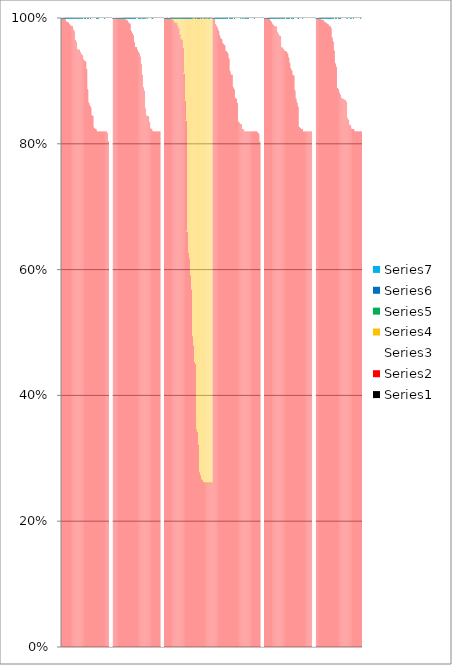
| Category | Series 0 | Series 1 | Series 2 | Series 3 | Series 4 | Series 5 | Series 6 |
|---|---|---|---|---|---|---|---|
| 0 | 0 | 1 | 0 | 0 | 0 | 0 | 0 |
| 1 | 0 | 1 | 0 | 0 | 0 | 0 | 0 |
| 2 | 0 | 0.999 | 0.001 | 0 | 0 | 0 | 0 |
| 3 | 0 | 0.999 | 0.001 | 0 | 0 | 0 | 0 |
| 4 | 0 | 0.999 | 0.001 | 0 | 0 | 0 | 0 |
| 5 | 0 | 0.995 | 0.005 | 0 | 0 | 0 | 0 |
| 6 | 0 | 0.993 | 0.007 | 0 | 0 | 0 | 0 |
| 7 | 0 | 0.993 | 0.007 | 0 | 0 | 0 | 0 |
| 8 | 0 | 0.991 | 0.009 | 0 | 0 | 0 | 0 |
| 9 | 0 | 0.989 | 0.011 | 0 | 0 | 0 | 0 |
| 10 | 0 | 0.987 | 0.013 | 0 | 0 | 0 | 0 |
| 11 | 0 | 0.987 | 0.013 | 0 | 0 | 0 | 0 |
| 12 | 0 | 0.982 | 0.018 | 0 | 0 | 0 | 0 |
| 13 | 0 | 0.979 | 0.021 | 0 | 0 | 0 | 0 |
| 14 | 0 | 0.965 | 0.035 | 0 | 0 | 0 | 0 |
| 15 | 0 | 0.962 | 0.038 | 0 | 0 | 0 | 0 |
| 16 | 0 | 0.95 | 0.05 | 0 | 0 | 0 | 0 |
| 17 | 0 | 0.95 | 0.05 | 0 | 0 | 0 | 0 |
| 18 | 0 | 0.95 | 0.05 | 0 | 0 | 0 | 0 |
| 19 | 0 | 0.945 | 0.055 | 0 | 0 | 0 | 0 |
| 20 | 0 | 0.942 | 0.058 | 0 | 0 | 0 | 0 |
| 21 | 0 | 0.94 | 0.06 | 0 | 0 | 0 | 0 |
| 22 | 0 | 0.934 | 0.066 | 0 | 0 | 0 | 0 |
| 23 | 0 | 0.931 | 0.069 | 0 | 0 | 0 | 0 |
| 24 | 0 | 0.931 | 0.069 | 0 | 0 | 0 | 0 |
| 25 | 0 | 0.918 | 0.082 | 0 | 0 | 0 | 0 |
| 26 | 0 | 0.886 | 0.114 | 0 | 0 | 0 | 0 |
| 27 | 0 | 0.865 | 0.135 | 0 | 0 | 0 | 0 |
| 28 | 0 | 0.861 | 0.139 | 0 | 0 | 0 | 0 |
| 29 | 0 | 0.858 | 0.142 | 0 | 0 | 0 | 0 |
| 30 | 0 | 0.845 | 0.155 | 0 | 0 | 0 | 0 |
| 31 | 0 | 0.844 | 0.156 | 0 | 0 | 0 | 0 |
| 32 | 0 | 0.826 | 0.174 | 0 | 0 | 0 | 0 |
| 33 | 0 | 0.824 | 0.176 | 0 | 0 | 0 | 0 |
| 34 | 0 | 0.824 | 0.176 | 0 | 0 | 0 | 0 |
| 35 | 0 | 0.82 | 0.18 | 0 | 0 | 0 | 0 |
| 36 | 0 | 0.82 | 0.18 | 0 | 0 | 0 | 0 |
| 37 | 0 | 0.82 | 0.18 | 0 | 0 | 0 | 0 |
| 38 | 0 | 0.82 | 0.18 | 0 | 0 | 0 | 0 |
| 39 | 0 | 0.82 | 0.18 | 0 | 0 | 0 | 0 |
| 40 | 0 | 0.82 | 0.18 | 0 | 0 | 0 | 0 |
| 41 | 0 | 0.82 | 0.18 | 0 | 0 | 0 | 0 |
| 42 | 0 | 0.82 | 0.18 | 0 | 0 | 0 | 0 |
| 43 | 0 | 0.82 | 0.18 | 0 | 0 | 0 | 0 |
| 44 | 0 | 0.82 | 0.18 | 0 | 0 | 0 | 0 |
| 45 | 0 | 0.817 | 0.183 | 0 | 0 | 0 | 0 |
| 46 | 0 | 0.804 | 0.196 | 0 | 0 | 0 | 0 |
| 47 | 0 | 0 | 1 | 0 | 0 | 0 | 0 |
| 48 | 0 | 0 | 1 | 0 | 0 | 0 | 0 |
| 49 | 0 | 0 | 1 | 0 | 0 | 0 | 0 |
| 50 | 0 | 1 | 0 | 0 | 0 | 0 | 0 |
| 51 | 0 | 1 | 0 | 0 | 0 | 0 | 0 |
| 52 | 0 | 1 | 0 | 0 | 0 | 0 | 0 |
| 53 | 0 | 1 | 0 | 0 | 0 | 0 | 0 |
| 54 | 0 | 1 | 0 | 0 | 0 | 0 | 0 |
| 55 | 0 | 1 | 0 | 0 | 0 | 0 | 0 |
| 56 | 0 | 1 | 0 | 0 | 0 | 0 | 0 |
| 57 | 0 | 1 | 0 | 0 | 0 | 0 | 0 |
| 58 | 0 | 1 | 0 | 0 | 0 | 0 | 0 |
| 59 | 0 | 1 | 0 | 0 | 0 | 0 | 0 |
| 60 | 0 | 0.999 | 0.001 | 0 | 0 | 0 | 0 |
| 61 | 0 | 0.999 | 0.001 | 0 | 0 | 0 | 0 |
| 62 | 0 | 0.998 | 0.002 | 0 | 0 | 0 | 0 |
| 63 | 0 | 0.998 | 0.002 | 0 | 0 | 0 | 0 |
| 64 | 0 | 0.997 | 0.003 | 0 | 0 | 0 | 0 |
| 65 | 0 | 0.994 | 0.006 | 0 | 0 | 0 | 0 |
| 66 | 0 | 0.992 | 0.008 | 0 | 0 | 0 | 0 |
| 67 | 0 | 0.991 | 0.009 | 0 | 0 | 0 | 0 |
| 68 | 0 | 0.98 | 0.02 | 0 | 0 | 0 | 0 |
| 69 | 0 | 0.976 | 0.024 | 0 | 0 | 0 | 0 |
| 70 | 0 | 0.973 | 0.027 | 0 | 0 | 0 | 0 |
| 71 | 0 | 0.962 | 0.038 | 0 | 0 | 0 | 0 |
| 72 | 0 | 0.954 | 0.046 | 0 | 0 | 0 | 0 |
| 73 | 0 | 0.954 | 0.046 | 0 | 0 | 0 | 0 |
| 74 | 0 | 0.95 | 0.05 | 0 | 0 | 0 | 0 |
| 75 | 0 | 0.946 | 0.054 | 0 | 0 | 0 | 0 |
| 76 | 0 | 0.944 | 0.056 | 0 | 0 | 0 | 0 |
| 77 | 0 | 0.939 | 0.061 | 0 | 0 | 0 | 0 |
| 78 | 0 | 0.927 | 0.073 | 0 | 0 | 0 | 0 |
| 79 | 0 | 0.91 | 0.09 | 0 | 0 | 0 | 0 |
| 80 | 0 | 0.89 | 0.11 | 0 | 0 | 0 | 0 |
| 81 | 0 | 0.884 | 0.116 | 0 | 0 | 0 | 0 |
| 82 | 0 | 0.856 | 0.144 | 0 | 0 | 0 | 0 |
| 83 | 0 | 0.845 | 0.155 | 0 | 0 | 0 | 0 |
| 84 | 0 | 0.844 | 0.156 | 0 | 0 | 0 | 0 |
| 85 | 0 | 0.843 | 0.157 | 0 | 0 | 0 | 0 |
| 86 | 0 | 0.834 | 0.166 | 0 | 0 | 0 | 0 |
| 87 | 0 | 0.824 | 0.176 | 0 | 0 | 0 | 0 |
| 88 | 0 | 0.824 | 0.176 | 0 | 0 | 0 | 0 |
| 89 | 0 | 0.82 | 0.18 | 0 | 0 | 0 | 0 |
| 90 | 0 | 0.82 | 0.18 | 0 | 0 | 0 | 0 |
| 91 | 0 | 0.82 | 0.18 | 0 | 0 | 0 | 0 |
| 92 | 0 | 0.82 | 0.18 | 0 | 0 | 0 | 0 |
| 93 | 0 | 0.82 | 0.18 | 0 | 0 | 0 | 0 |
| 94 | 0 | 0.82 | 0.18 | 0 | 0 | 0 | 0 |
| 95 | 0 | 0.82 | 0.18 | 0 | 0 | 0 | 0 |
| 96 | 0 | 0.82 | 0.18 | 0 | 0 | 0 | 0 |
| 97 | 0 | 0 | 1 | 0 | 0 | 0 | 0 |
| 98 | 0 | 0 | 1 | 0 | 0 | 0 | 0 |
| 99 | 0 | 0 | 1 | 0 | 0 | 0 | 0 |
| 100 | 0 | 1 | 0 | 0 | 0 | 0 | 0 |
| 101 | 0 | 1 | 0 | 0 | 0 | 0 | 0 |
| 102 | 0 | 1 | 0 | 0 | 0 | 0 | 0 |
| 103 | 0 | 1 | 0 | 0 | 0 | 0 | 0 |
| 104 | 0 | 1 | 0 | 0 | 0 | 0 | 0 |
| 105 | 0 | 1 | 0 | 0 | 0 | 0 | 0 |
| 106 | 0 | 0.999 | 0 | 0.001 | 0 | 0 | 0 |
| 107 | 0 | 0.999 | 0 | 0.001 | 0 | 0 | 0 |
| 108 | 0 | 0.998 | 0 | 0.002 | 0 | 0 | 0 |
| 109 | 0 | 0.996 | 0 | 0.004 | 0 | 0 | 0 |
| 110 | 0 | 0.993 | 0 | 0.007 | 0 | 0 | 0 |
| 111 | 0 | 0.993 | 0 | 0.007 | 0 | 0 | 0 |
| 112 | 0 | 0.992 | 0 | 0.008 | 0 | 0 | 0 |
| 113 | 0 | 0.988 | 0 | 0.012 | 0 | 0 | 0 |
| 114 | 0 | 0.984 | 0 | 0.016 | 0 | 0 | 0 |
| 115 | 0 | 0.974 | 0 | 0.026 | 0 | 0 | 0 |
| 116 | 0 | 0.968 | 0 | 0.032 | 0 | 0 | 0 |
| 117 | 0 | 0.966 | 0 | 0.034 | 0 | 0 | 0 |
| 118 | 0 | 0.952 | 0 | 0.048 | 0 | 0 | 0 |
| 119 | 0 | 0.912 | 0 | 0.088 | 0 | 0 | 0 |
| 120 | 0 | 0.868 | 0 | 0.132 | 0 | 0 | 0 |
| 121 | 0 | 0.837 | 0 | 0.163 | 0 | 0 | 0 |
| 122 | 0 | 0.66 | 0 | 0.34 | 0 | 0 | 0 |
| 123 | 0 | 0.627 | 0 | 0.373 | 0 | 0 | 0 |
| 124 | 0 | 0.617 | 0 | 0.383 | 0 | 0 | 0 |
| 125 | 0 | 0.591 | 0 | 0.409 | 0 | 0 | 0 |
| 126 | 0 | 0.568 | 0 | 0.432 | 0 | 0 | 0 |
| 127 | 0 | 0.494 | 0 | 0.506 | 0 | 0 | 0 |
| 128 | 0 | 0.479 | 0 | 0.521 | 0 | 0 | 0 |
| 129 | 0 | 0.453 | 0 | 0.547 | 0 | 0 | 0 |
| 130 | 0 | 0.45 | 0 | 0.55 | 0 | 0 | 0 |
| 131 | 0 | 0.346 | 0 | 0.654 | 0 | 0 | 0 |
| 132 | 0 | 0.342 | 0 | 0.658 | 0 | 0 | 0 |
| 133 | 0 | 0.322 | 0 | 0.678 | 0 | 0 | 0 |
| 134 | 0 | 0.278 | 0 | 0.722 | 0 | 0 | 0 |
| 135 | 0 | 0.273 | 0 | 0.727 | 0 | 0 | 0 |
| 136 | 0 | 0.267 | 0 | 0.733 | 0 | 0 | 0 |
| 137 | 0 | 0.266 | 0 | 0.734 | 0 | 0 | 0 |
| 138 | 0 | 0.262 | 0 | 0.738 | 0 | 0 | 0 |
| 139 | 0 | 0.262 | 0 | 0.738 | 0 | 0 | 0 |
| 140 | 0 | 0.262 | 0 | 0.738 | 0 | 0 | 0 |
| 141 | 0 | 0.262 | 0 | 0.738 | 0 | 0 | 0 |
| 142 | 0 | 0.262 | 0 | 0.738 | 0 | 0 | 0 |
| 143 | 0 | 0.262 | 0 | 0.738 | 0 | 0 | 0 |
| 144 | 0 | 0.262 | 0 | 0.738 | 0 | 0 | 0 |
| 145 | 0 | 0.262 | 0 | 0.738 | 0 | 0 | 0 |
| 146 | 0 | 0.262 | 0 | 0.738 | 0 | 0 | 0 |
| 147 | 0 | 1 | 0 | 0 | 0 | 0 | 0 |
| 148 | 0 | 1 | 0 | 0 | 0 | 0 | 0 |
| 149 | 0 | 0.999 | 0.001 | 0 | 0 | 0 | 0 |
| 150 | 0 | 0.99 | 0.01 | 0 | 0 | 0 | 0 |
| 151 | 0 | 0.987 | 0.013 | 0 | 0 | 0 | 0 |
| 152 | 0 | 0.984 | 0.016 | 0 | 0 | 0 | 0 |
| 153 | 0 | 0.979 | 0.021 | 0 | 0 | 0 | 0 |
| 154 | 0 | 0.972 | 0.028 | 0 | 0 | 0 | 0 |
| 155 | 0 | 0.968 | 0.032 | 0 | 0 | 0 | 0 |
| 156 | 0 | 0.966 | 0.034 | 0 | 0 | 0 | 0 |
| 157 | 0 | 0.96 | 0.04 | 0 | 0 | 0 | 0 |
| 158 | 0 | 0.958 | 0.042 | 0 | 0 | 0 | 0 |
| 159 | 0 | 0.956 | 0.044 | 0 | 0 | 0 | 0 |
| 160 | 0 | 0.947 | 0.053 | 0 | 0 | 0 | 0 |
| 161 | 0 | 0.946 | 0.054 | 0 | 0 | 0 | 0 |
| 162 | 0 | 0.943 | 0.057 | 0 | 0 | 0 | 0 |
| 163 | 0 | 0.936 | 0.064 | 0 | 0 | 0 | 0 |
| 164 | 0 | 0.915 | 0.085 | 0 | 0 | 0 | 0 |
| 165 | 0 | 0.91 | 0.09 | 0 | 0 | 0 | 0 |
| 166 | 0 | 0.91 | 0.09 | 0 | 0 | 0 | 0 |
| 167 | 0 | 0.89 | 0.11 | 0 | 0 | 0 | 0 |
| 168 | 0 | 0.887 | 0.113 | 0 | 0 | 0 | 0 |
| 169 | 0 | 0.873 | 0.127 | 0 | 0 | 0 | 0 |
| 170 | 0 | 0.872 | 0.128 | 0 | 0 | 0 | 0 |
| 171 | 0 | 0.865 | 0.135 | 0 | 0 | 0 | 0 |
| 172 | 0 | 0.836 | 0.164 | 0 | 0 | 0 | 0 |
| 173 | 0 | 0.834 | 0.166 | 0 | 0 | 0 | 0 |
| 174 | 0 | 0.832 | 0.168 | 0 | 0 | 0 | 0 |
| 175 | 0 | 0.831 | 0.169 | 0 | 0 | 0 | 0 |
| 176 | 0 | 0.824 | 0.176 | 0 | 0 | 0 | 0 |
| 177 | 0 | 0.823 | 0.177 | 0 | 0 | 0 | 0 |
| 178 | 0 | 0.82 | 0.18 | 0 | 0 | 0 | 0 |
| 179 | 0 | 0.82 | 0.18 | 0 | 0 | 0 | 0 |
| 180 | 0 | 0.82 | 0.18 | 0 | 0 | 0 | 0 |
| 181 | 0 | 0.82 | 0.18 | 0 | 0 | 0 | 0 |
| 182 | 0 | 0.82 | 0.18 | 0 | 0 | 0 | 0 |
| 183 | 0 | 0.82 | 0.18 | 0 | 0 | 0 | 0 |
| 184 | 0 | 0.82 | 0.18 | 0 | 0 | 0 | 0 |
| 185 | 0 | 0.82 | 0.18 | 0 | 0 | 0 | 0 |
| 186 | 0 | 0.82 | 0.18 | 0 | 0 | 0 | 0 |
| 187 | 0 | 0.82 | 0.18 | 0 | 0 | 0 | 0 |
| 188 | 0 | 0.82 | 0.18 | 0 | 0 | 0 | 0 |
| 189 | 0 | 0.82 | 0.18 | 0 | 0 | 0 | 0 |
| 190 | 0 | 0.82 | 0.18 | 0 | 0 | 0 | 0 |
| 191 | 0 | 0.817 | 0.183 | 0 | 0 | 0 | 0 |
| 192 | 0 | 0.816 | 0.184 | 0 | 0 | 0 | 0 |
| 193 | 0 | 0.803 | 0.197 | 0 | 0 | 0 | 0 |
| 194 | 0 | 0 | 1 | 0 | 0 | 0 | 0 |
| 195 | 0 | 0 | 1 | 0 | 0 | 0 | 0 |
| 196 | 0 | 0 | 1 | 0 | 0 | 0 | 0 |
| 197 | 0 | 1 | 0 | 0 | 0 | 0 | 0 |
| 198 | 0 | 1 | 0 | 0 | 0 | 0 | 0 |
| 199 | 0 | 1 | 0 | 0 | 0 | 0 | 0 |
| 200 | 0 | 1 | 0 | 0 | 0 | 0 | 0 |
| 201 | 0 | 1 | 0 | 0 | 0 | 0 | 0 |
| 202 | 0 | 0.999 | 0.001 | 0 | 0 | 0 | 0 |
| 203 | 0 | 0.997 | 0.003 | 0 | 0 | 0 | 0 |
| 204 | 0 | 0.995 | 0.005 | 0 | 0 | 0 | 0 |
| 205 | 0 | 0.991 | 0.009 | 0 | 0 | 0 | 0 |
| 206 | 0 | 0.989 | 0.011 | 0 | 0 | 0 | 0 |
| 207 | 0 | 0.987 | 0.013 | 0 | 0 | 0 | 0 |
| 208 | 0 | 0.987 | 0.013 | 0 | 0 | 0 | 0 |
| 209 | 0 | 0.987 | 0.013 | 0 | 0 | 0 | 0 |
| 210 | 0 | 0.978 | 0.022 | 0 | 0 | 0 | 0 |
| 211 | 0 | 0.974 | 0.026 | 0 | 0 | 0 | 0 |
| 212 | 0 | 0.972 | 0.028 | 0 | 0 | 0 | 0 |
| 213 | 0 | 0.971 | 0.029 | 0 | 0 | 0 | 0 |
| 214 | 0 | 0.954 | 0.046 | 0 | 0 | 0 | 0 |
| 215 | 0 | 0.953 | 0.047 | 0 | 0 | 0 | 0 |
| 216 | 0 | 0.95 | 0.05 | 0 | 0 | 0 | 0 |
| 217 | 0 | 0.947 | 0.053 | 0 | 0 | 0 | 0 |
| 218 | 0 | 0.947 | 0.053 | 0 | 0 | 0 | 0 |
| 219 | 0 | 0.946 | 0.054 | 0 | 0 | 0 | 0 |
| 220 | 0 | 0.943 | 0.057 | 0 | 0 | 0 | 0 |
| 221 | 0 | 0.937 | 0.063 | 0 | 0 | 0 | 0 |
| 222 | 0 | 0.928 | 0.072 | 0 | 0 | 0 | 0 |
| 223 | 0 | 0.919 | 0.081 | 0 | 0 | 0 | 0 |
| 224 | 0 | 0.916 | 0.084 | 0 | 0 | 0 | 0 |
| 225 | 0 | 0.909 | 0.091 | 0 | 0 | 0 | 0 |
| 226 | 0 | 0.909 | 0.091 | 0 | 0 | 0 | 0 |
| 227 | 0 | 0.885 | 0.115 | 0 | 0 | 0 | 0 |
| 228 | 0 | 0.872 | 0.128 | 0 | 0 | 0 | 0 |
| 229 | 0 | 0.866 | 0.134 | 0 | 0 | 0 | 0 |
| 230 | 0 | 0.859 | 0.141 | 0 | 0 | 0 | 0 |
| 231 | 0 | 0.827 | 0.173 | 0 | 0 | 0 | 0 |
| 232 | 0 | 0.826 | 0.174 | 0 | 0 | 0 | 0 |
| 233 | 0 | 0.824 | 0.176 | 0 | 0 | 0 | 0 |
| 234 | 0 | 0.824 | 0.176 | 0 | 0 | 0 | 0 |
| 235 | 0 | 0.82 | 0.18 | 0 | 0 | 0 | 0 |
| 236 | 0 | 0.82 | 0.18 | 0 | 0 | 0 | 0 |
| 237 | 0 | 0.82 | 0.18 | 0 | 0 | 0 | 0 |
| 238 | 0 | 0.82 | 0.18 | 0 | 0 | 0 | 0 |
| 239 | 0 | 0.82 | 0.18 | 0 | 0 | 0 | 0 |
| 240 | 0 | 0.82 | 0.18 | 0 | 0 | 0 | 0 |
| 241 | 0 | 0.82 | 0.18 | 0 | 0 | 0 | 0 |
| 242 | 0 | 0.82 | 0.18 | 0 | 0 | 0 | 0 |
| 243 | 0 | 0.82 | 0.18 | 0 | 0 | 0 | 0 |
| 244 | 0 | 0 | 1 | 0 | 0 | 0 | 0 |
| 245 | 0 | 0 | 1 | 0 | 0 | 0 | 0 |
| 246 | 0 | 0 | 1 | 0 | 0 | 0 | 0 |
| 247 | 0 | 1 | 0 | 0 | 0 | 0 | 0 |
| 248 | 0 | 1 | 0 | 0 | 0 | 0 | 0 |
| 249 | 0 | 1 | 0 | 0 | 0 | 0 | 0 |
| 250 | 0 | 1 | 0 | 0 | 0 | 0 | 0 |
| 251 | 0 | 0.999 | 0.001 | 0 | 0 | 0 | 0 |
| 252 | 0 | 0.998 | 0.002 | 0 | 0 | 0 | 0 |
| 253 | 0 | 0.997 | 0.003 | 0 | 0 | 0 | 0 |
| 254 | 0 | 0.997 | 0.003 | 0 | 0 | 0 | 0 |
| 255 | 0 | 0.996 | 0.004 | 0 | 0 | 0 | 0 |
| 256 | 0 | 0.993 | 0.007 | 0 | 0 | 0 | 0 |
| 257 | 0 | 0.993 | 0.007 | 0 | 0 | 0 | 0 |
| 258 | 0 | 0.991 | 0.009 | 0 | 0 | 0 | 0 |
| 259 | 0 | 0.99 | 0.01 | 0 | 0 | 0 | 0 |
| 260 | 0 | 0.988 | 0.012 | 0 | 0 | 0 | 0 |
| 261 | 0 | 0.987 | 0.013 | 0 | 0 | 0 | 0 |
| 262 | 0 | 0.985 | 0.015 | 0 | 0 | 0 | 0 |
| 263 | 0 | 0.969 | 0.031 | 0 | 0 | 0 | 0 |
| 264 | 0 | 0.963 | 0.037 | 0 | 0 | 0 | 0 |
| 265 | 0 | 0.948 | 0.052 | 0 | 0 | 0 | 0 |
| 266 | 0 | 0.928 | 0.072 | 0 | 0 | 0 | 0 |
| 267 | 0 | 0.923 | 0.077 | 0 | 0 | 0 | 0 |
| 268 | 0 | 0.889 | 0.111 | 0 | 0 | 0 | 0 |
| 269 | 0 | 0.887 | 0.113 | 0 | 0 | 0 | 0 |
| 270 | 0 | 0.882 | 0.118 | 0 | 0 | 0 | 0 |
| 271 | 0 | 0.879 | 0.121 | 0 | 0 | 0 | 0 |
| 272 | 0 | 0.873 | 0.127 | 0 | 0 | 0 | 0 |
| 273 | 0 | 0.872 | 0.128 | 0 | 0 | 0 | 0 |
| 274 | 0 | 0.871 | 0.129 | 0 | 0 | 0 | 0 |
| 275 | 0 | 0.87 | 0.13 | 0 | 0 | 0 | 0 |
| 276 | 0 | 0.87 | 0.13 | 0 | 0 | 0 | 0 |
| 277 | 0 | 0.866 | 0.134 | 0 | 0 | 0 | 0 |
| 278 | 0 | 0.841 | 0.159 | 0 | 0 | 0 | 0 |
| 279 | 0 | 0.838 | 0.162 | 0 | 0 | 0 | 0 |
| 280 | 0 | 0.83 | 0.17 | 0 | 0 | 0 | 0 |
| 281 | 0 | 0.829 | 0.171 | 0 | 0 | 0 | 0 |
| 282 | 0 | 0.824 | 0.176 | 0 | 0 | 0 | 0 |
| 283 | 0 | 0.824 | 0.176 | 0 | 0 | 0 | 0 |
| 284 | 0 | 0.823 | 0.177 | 0 | 0 | 0 | 0 |
| 285 | 0 | 0.82 | 0.18 | 0 | 0 | 0 | 0 |
| 286 | 0 | 0.82 | 0.18 | 0 | 0 | 0 | 0 |
| 287 | 0 | 0.82 | 0.18 | 0 | 0 | 0 | 0 |
| 288 | 0 | 0.82 | 0.18 | 0 | 0 | 0 | 0 |
| 289 | 0 | 0.82 | 0.18 | 0 | 0 | 0 | 0 |
| 290 | 0 | 0.82 | 0.18 | 0 | 0 | 0 | 0 |
| 291 | 0 | 0.82 | 0.18 | 0 | 0 | 0 | 0 |